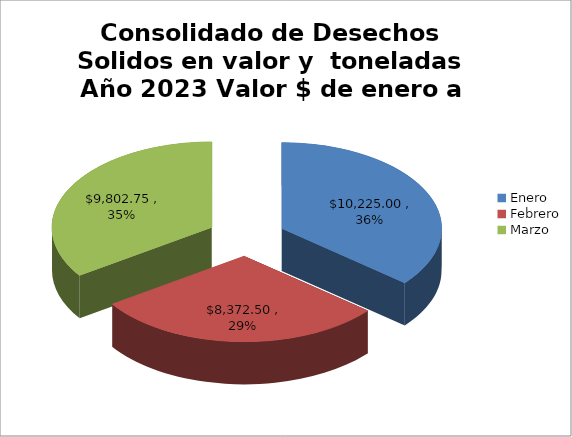
| Category | Consolidado de Desechos Solidos en valor y  toneladas Año 2023 Valor $ | Consolidado de Desechos Solidos en valor y  toneladas Año 2023 Toneladas |
|---|---|---|
| Enero | 10225 | 409 |
| Febrero | 8372.5 | 334.9 |
| Marzo | 9802.75 | 392.11 |